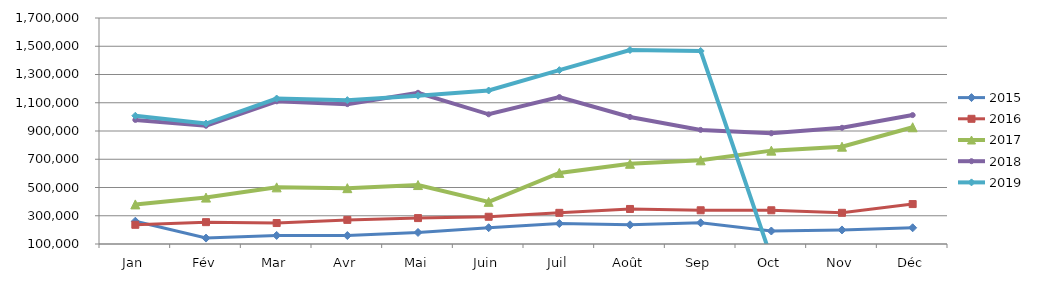
| Category | 2015 | 2016 | 2017 | 2018 | 2019 |
|---|---|---|---|---|---|
| Jan | 261318.341 | 235903.093 | 380222.25 | 978468.279 | 1007982.373 |
| Fév | 141903.915 | 254650.591 | 428502.997 | 937137.209 | 952616.766 |
| Mar | 160681.774 | 248425.98 | 500955.694 | 1110199.711 | 1129815.679 |
| Avr | 159954.523 | 270687.752 | 495255.535 | 1090229.308 | 1118398.221 |
| Mai | 181677.436 | 283507.34 | 517298.538 | 1170512.154 | 1150217.455 |
| Juin | 215418.896 | 292820.053 | 398427.247 | 1018295.812 | 1186623.687 |
| Juil | 244989.187 | 320615.91 | 603419.402 | 1140133.118 | 1330812.699 |
| Août | 235890.85 | 348014.816 | 667973.667 | 999343.146 | 1473280.035 |
| Sep | 250009.095 | 338807.949 | 692403.495 | 907808.882 | 1466448.158 |
| Oct | 191980.124 | 338820.212 | 760969.174 | 883825.979 | 0 |
| Nov | 199530.979 | 320858.147 | 789037.665 | 922678.039 | 0 |
| Déc | 214723.876 | 382727.181 | 926372.399 | 1012620.724 | 0 |